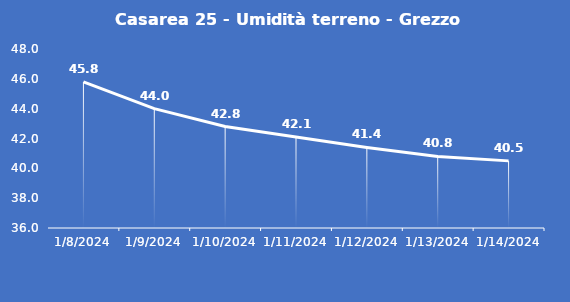
| Category | Casarea 25 - Umidità terreno - Grezzo (%VWC) |
|---|---|
| 1/8/24 | 45.8 |
| 1/9/24 | 44 |
| 1/10/24 | 42.8 |
| 1/11/24 | 42.1 |
| 1/12/24 | 41.4 |
| 1/13/24 | 40.8 |
| 1/14/24 | 40.5 |